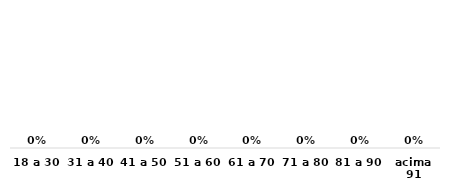
| Category | Series 0 |
|---|---|
| 18 a 30 | 0 |
| 31 a 40 | 0 |
| 41 a 50 | 0 |
| 51 a 60 | 0 |
| 61 a 70 | 0 |
| 71 a 80 | 0 |
| 81 a 90 | 0 |
| acima 91 | 0 |